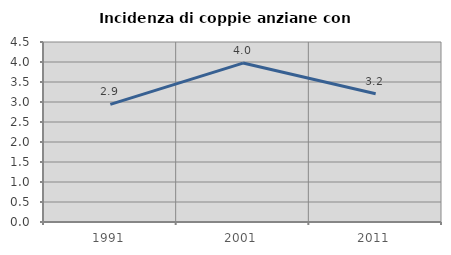
| Category | Incidenza di coppie anziane con figli |
|---|---|
| 1991.0 | 2.941 |
| 2001.0 | 3.974 |
| 2011.0 | 3.205 |